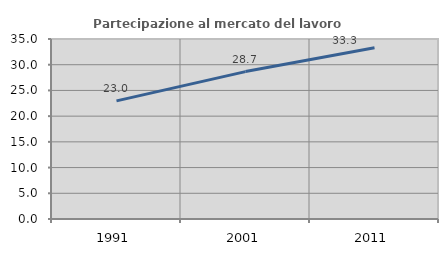
| Category | Partecipazione al mercato del lavoro  femminile |
|---|---|
| 1991.0 | 22.966 |
| 2001.0 | 28.662 |
| 2011.0 | 33.303 |